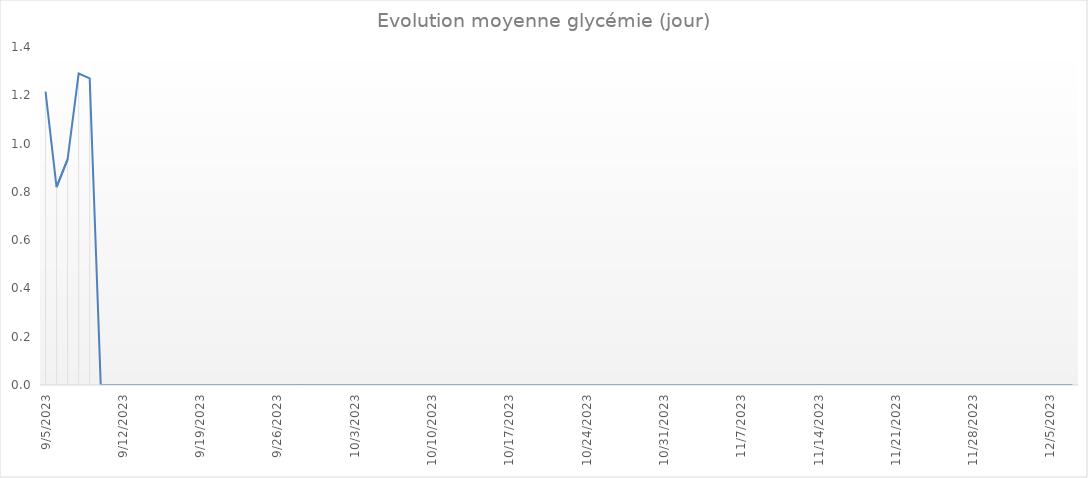
| Category | Series 0 |
|---|---|
| 9/5/23 | 1.215 |
| 9/6/23 | 0.82 |
| 9/7/23 | 0.935 |
| 9/8/23 | 1.29 |
| 9/9/23 | 1.27 |
| 9/10/23 | 0 |
| 9/11/23 | 0 |
| 9/12/23 | 0 |
| 9/13/23 | 0 |
| 9/14/23 | 0 |
| 9/15/23 | 0 |
| 9/16/23 | 0 |
| 9/17/23 | 0 |
| 9/18/23 | 0 |
| 9/19/23 | 0 |
| 9/20/23 | 0 |
| 9/21/23 | 0 |
| 9/22/23 | 0 |
| 9/23/23 | 0 |
| 9/24/23 | 0 |
| 9/25/23 | 0 |
| 9/26/23 | 0 |
| 9/27/23 | 0 |
| 9/28/23 | 0 |
| 9/29/23 | 0 |
| 9/30/23 | 0 |
| 10/1/23 | 0 |
| 10/2/23 | 0 |
| 10/3/23 | 0 |
| 10/4/23 | 0 |
| 10/5/23 | 0 |
| 10/6/23 | 0 |
| 10/7/23 | 0 |
| 10/8/23 | 0 |
| 10/9/23 | 0 |
| 10/10/23 | 0 |
| 10/11/23 | 0 |
| 10/12/23 | 0 |
| 10/13/23 | 0 |
| 10/14/23 | 0 |
| 10/15/23 | 0 |
| 10/16/23 | 0 |
| 10/17/23 | 0 |
| 10/18/23 | 0 |
| 10/19/23 | 0 |
| 10/20/23 | 0 |
| 10/21/23 | 0 |
| 10/22/23 | 0 |
| 10/23/23 | 0 |
| 10/24/23 | 0 |
| 10/25/23 | 0 |
| 10/26/23 | 0 |
| 10/27/23 | 0 |
| 10/28/23 | 0 |
| 10/29/23 | 0 |
| 10/30/23 | 0 |
| 10/31/23 | 0 |
| 11/1/23 | 0 |
| 11/2/23 | 0 |
| 11/3/23 | 0 |
| 11/4/23 | 0 |
| 11/5/23 | 0 |
| 11/6/23 | 0 |
| 11/7/23 | 0 |
| 11/8/23 | 0 |
| 11/9/23 | 0 |
| 11/10/23 | 0 |
| 11/11/23 | 0 |
| 11/12/23 | 0 |
| 11/13/23 | 0 |
| 11/14/23 | 0 |
| 11/15/23 | 0 |
| 11/16/23 | 0 |
| 11/17/23 | 0 |
| 11/18/23 | 0 |
| 11/19/23 | 0 |
| 11/20/23 | 0 |
| 11/21/23 | 0 |
| 11/22/23 | 0 |
| 11/23/23 | 0 |
| 11/24/23 | 0 |
| 11/25/23 | 0 |
| 11/26/23 | 0 |
| 11/27/23 | 0 |
| 11/28/23 | 0 |
| 11/29/23 | 0 |
| 11/30/23 | 0 |
| 12/1/23 | 0 |
| 12/2/23 | 0 |
| 12/3/23 | 0 |
| 12/4/23 | 0 |
| 12/5/23 | 0 |
| 12/6/23 | 0 |
| 12/7/23 | 0 |